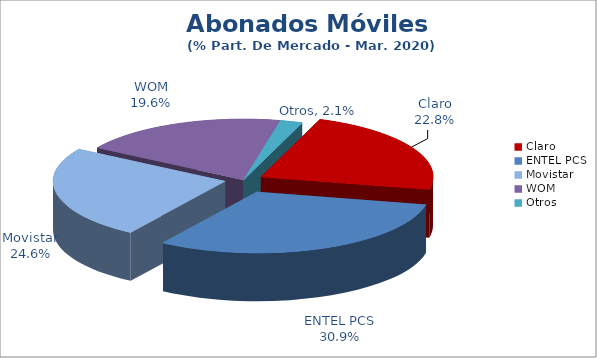
| Category | Series 0 |
|---|---|
| Claro | 0.228 |
| ENTEL PCS | 0.309 |
| Movistar | 0.246 |
| WOM | 0.196 |
| Otros | 0.021 |